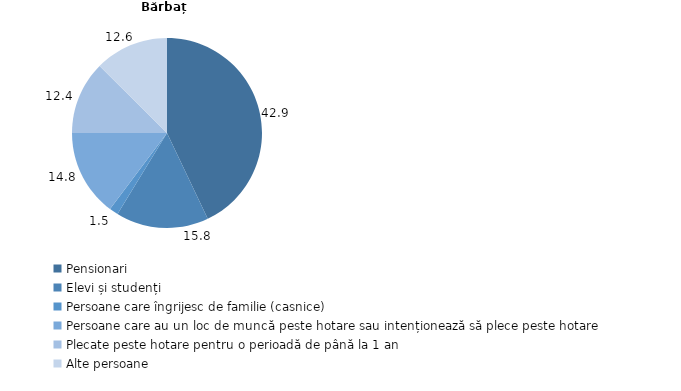
| Category | Bărbați |
|---|---|
| Pensionari | 42.943 |
| Elevi și studenți | 15.776 |
| Persoane care îngrijesc de familie (casnice) | 1.514 |
| Persoane care au un loc de muncă peste hotare sau intenționează să plece peste hotare | 14.789 |
| Plecate peste hotare pentru o perioadă de până la 1 an | 12.425 |
| Alte persoane | 12.555 |